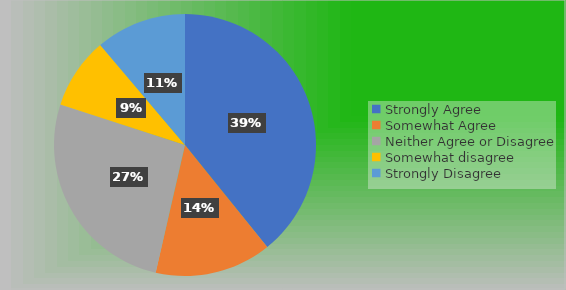
| Category | Series 0 |
|---|---|
| Strongly Agree | 49 |
| Somewhat Agree | 18 |
| Neither Agree or Disagree | 33 |
| Somewhat disagree | 11 |
| Strongly Disagree | 14 |